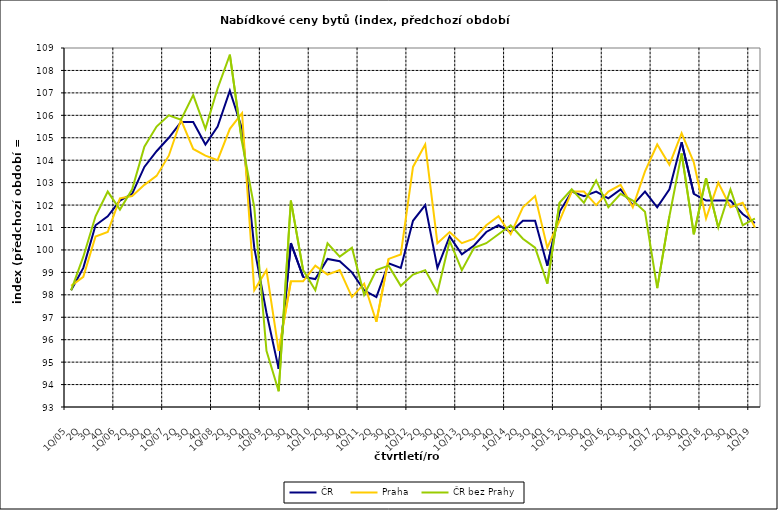
| Category | ČR  | Praha | ČR bez Prahy  |
|---|---|---|---|
| 1Q/05 | 98.2 | 98.4 | 98.2 |
| 2Q | 99.2 | 98.8 | 99.7 |
| 3Q | 101.1 | 100.6 | 101.5 |
| 4Q | 101.5 | 100.8 | 102.6 |
| 1Q/06 | 102.2 | 102.3 | 101.8 |
| 2Q | 102.5 | 102.4 | 102.7 |
| 3Q | 103.7 | 102.9 | 104.6 |
| 4Q | 104.4 | 103.3 | 105.5 |
| 1Q/07 | 105 | 104.2 | 106 |
| 2Q | 105.7 | 105.8 | 105.8 |
| 3Q | 105.7 | 104.5 | 106.9 |
| 4Q | 104.7 | 104.2 | 105.4 |
| 1Q/08 | 105.5 | 104 | 107.2 |
| 2Q | 107.1 | 105.4 | 108.7 |
| 3Q | 105.4 | 106.1 | 104.8 |
| 4Q | 100.1 | 98.2 | 101.9 |
| 1Q/09 | 97.2 | 99.1 | 95.5 |
| 2Q | 94.7 | 95.5 | 93.7 |
| 3Q | 100.3 | 98.6 | 102.2 |
| 4Q | 98.8 | 98.6 | 99.1 |
| 1Q/10 | 98.7 | 99.3 | 98.2 |
| 2Q | 99.6 | 98.9 | 100.3 |
| 3Q | 99.5 | 99.1 | 99.7 |
| 4Q | 99 | 97.9 | 100.1 |
| 1Q/11 | 98.2 | 98.5 | 98 |
| 2Q | 97.9 | 96.8 | 99.1 |
| 3Q | 99.4 | 99.6 | 99.3 |
| 4Q | 99.2 | 99.8 | 98.4 |
| 1Q/12 | 101.3 | 103.7 | 98.9 |
| 2Q | 102 | 104.7 | 99.1 |
| 3Q | 99.2 | 100.3 | 98.1 |
| 4Q | 100.6 | 100.8 | 100.4 |
| 1Q/13 | 99.8 | 100.3 | 99.1 |
| 2Q | 100.2 | 100.5 | 100.1 |
| 3Q | 100.8 | 101.1 | 100.3 |
| 4Q | 101.1 | 101.5 | 100.7 |
| 1Q/14 | 100.8 | 100.7 | 101.1 |
| 2Q | 101.3 | 101.9 | 100.5 |
| 3Q | 101.3 | 102.4 | 100.1 |
| 4Q | 99.3 | 100.1 | 98.5 |
| 1Q/15 | 101.7 | 101.3 | 102.1 |
| 2Q | 102.6 | 102.6 | 102.7 |
| 3Q | 102.4 | 102.6 | 102.1 |
| 4Q | 102.6 | 102 | 103.1 |
| 1Q/16 | 102.3 | 102.6 | 101.9 |
| 2Q | 102.7 | 102.9 | 102.5 |
| 3Q | 102 | 101.9 | 102.2 |
| 4Q | 102.6 | 103.5 | 101.7 |
| 1Q/17 | 101.9 | 104.7 | 98.3 |
| 2Q | 102.7 | 103.8 | 101.5 |
| 3Q | 104.8 | 105.2 | 104.3 |
| 4Q | 102.5 | 103.9 | 100.7 |
| 1Q/18 | 102.2 | 101.4 | 103.2 |
| 2Q | 102.2 | 103 | 101 |
| 3Q | 102.2 | 101.9 | 102.7 |
| 4Q | 101.6 | 102.1 | 101.1 |
| 1Q/19 | 101.2 | 101 | 101.4 |